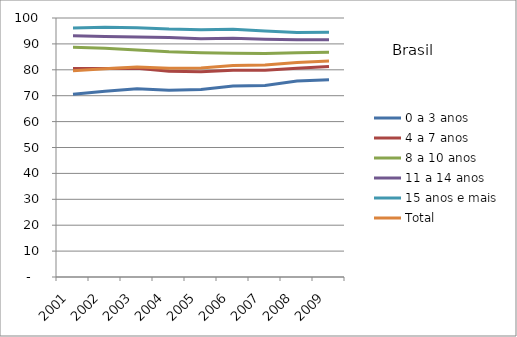
| Category | 0 a 3 anos | 4 a 7 anos | 8 a 10 anos | 11 a 14 anos | 15 anos e mais | Total |
|---|---|---|---|---|---|---|
| 2001.0 | 70.55 | 80.49 | 88.73 | 93.12 | 96.18 | 79.66 |
| 2002.0 | 71.7 | 80.48 | 88.36 | 92.88 | 96.39 | 80.42 |
| 2003.0 | 72.7 | 80.57 | 87.68 | 92.67 | 96.28 | 81.05 |
| 2004.0 | 72.15 | 79.44 | 87 | 92.5 | 95.75 | 80.56 |
| 2005.0 | 72.39 | 79.23 | 86.63 | 92.02 | 95.5 | 80.69 |
| 2006.0 | 73.75 | 79.85 | 86.43 | 92.18 | 95.62 | 81.69 |
| 2007.0 | 73.95 | 79.82 | 86.27 | 91.82 | 95.01 | 81.83 |
| 2008.0 | 75.63 | 80.57 | 86.55 | 91.64 | 94.38 | 82.84 |
| 2009.0 | 76.13 | 81.28 | 86.74 | 91.56 | 94.53 | 83.37 |